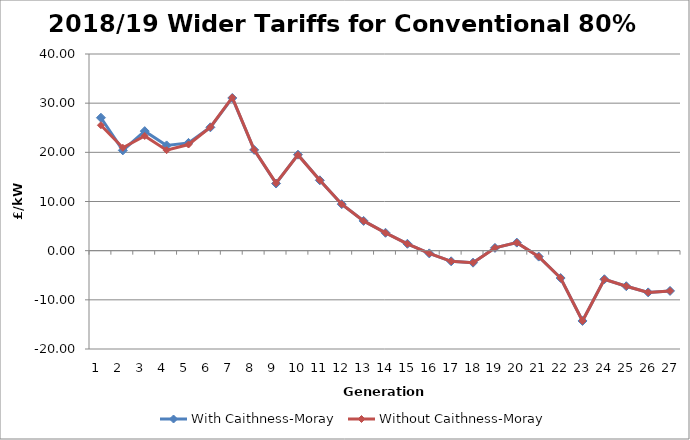
| Category | With Caithness-Moray | Without Caithness-Moray |
|---|---|---|
| 1.0 | 27.034 | 25.513 |
| 2.0 | 20.398 | 20.93 |
| 3.0 | 24.311 | 23.325 |
| 4.0 | 21.407 | 20.435 |
| 5.0 | 21.92 | 21.592 |
| 6.0 | 25.087 | 25.11 |
| 7.0 | 31.056 | 31.158 |
| 8.0 | 20.494 | 20.51 |
| 9.0 | 13.657 | 13.727 |
| 10.0 | 19.526 | 19.476 |
| 11.0 | 14.312 | 14.34 |
| 12.0 | 9.463 | 9.453 |
| 13.0 | 6.051 | 6.051 |
| 14.0 | 3.639 | 3.633 |
| 15.0 | 1.397 | 1.395 |
| 16.0 | -0.552 | -0.554 |
| 17.0 | -2.166 | -2.168 |
| 18.0 | -2.444 | -2.446 |
| 19.0 | 0.567 | 0.565 |
| 20.0 | 1.636 | 1.634 |
| 21.0 | -1.207 | -1.21 |
| 22.0 | -5.565 | -5.568 |
| 23.0 | -14.296 | -14.298 |
| 24.0 | -5.813 | -5.815 |
| 25.0 | -7.233 | -7.236 |
| 26.0 | -8.489 | -8.491 |
| 27.0 | -8.19 | -8.192 |